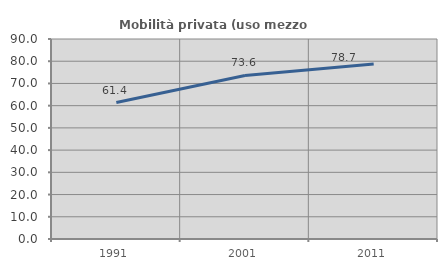
| Category | Mobilità privata (uso mezzo privato) |
|---|---|
| 1991.0 | 61.405 |
| 2001.0 | 73.583 |
| 2011.0 | 78.713 |